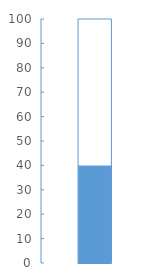
| Category | Actual |
|---|---|
| 0 | 40 |